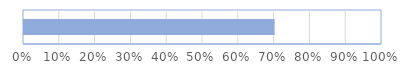
| Category | Series 0 |
|---|---|
| 0 | 0.7 |